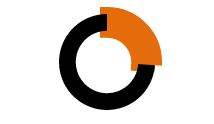
| Category | Series 0 |
|---|---|
| 0 | 0.261 |
| 1 | 0.739 |